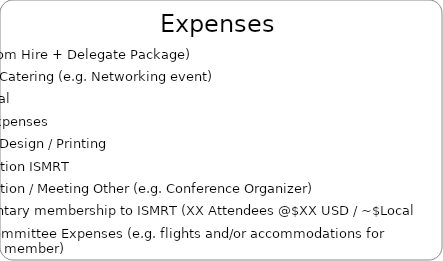
| Category | Series 0 |
|---|---|
| Venue (Room Hire + Delegate Package) | 0 |
| Additional Catering (e.g. Networking event) | 0 |
| Audio Visual | 0 |
| Speaker Expenses | 0 |
| Branding / Design / Printing  | 0 |
| Administration ISMRT | 0 |
| Administration / Meeting Other (e.g. Conference Organizer) | 0 |
| Complimentary membership to ISMRT (XX Attendees @$XX USD / ~$Local currency) | 0 |
| Chapter Committee Expenses (e.g. flights and/or accommodations for committee member) | 0 |
| On-site Expenses | 0 |
| Exhibition (e.g. additional equipment, trade tables, etc. in exhibition area) | 0 |
| Bank Fees | 0 |